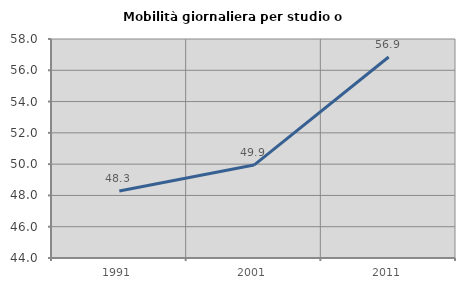
| Category | Mobilità giornaliera per studio o lavoro |
|---|---|
| 1991.0 | 48.289 |
| 2001.0 | 49.939 |
| 2011.0 | 56.85 |